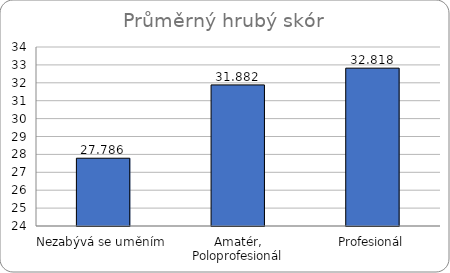
| Category | Průměrný HS |
|---|---|
| Nezabývá se uměním | 27.786 |
| Amatér, Poloprofesionál | 31.882 |
| Profesionál | 32.818 |